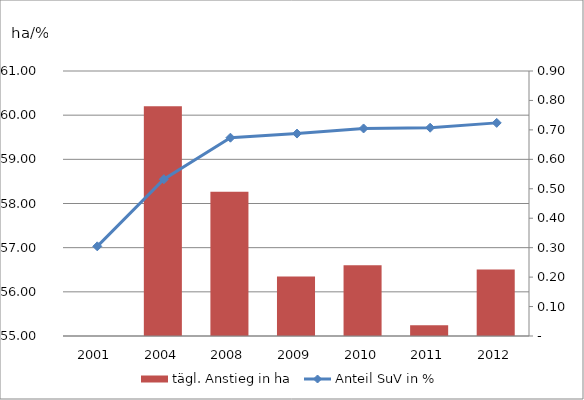
| Category | tägl. Anstieg in ha |
|---|---|
| 0 | 0 |
| 1 | 0.78 |
| 2 | 0.49 |
| 3 | 0.202 |
| 4 | 0.24 |
| 5 | 0.036 |
| 6 | 0.226 |